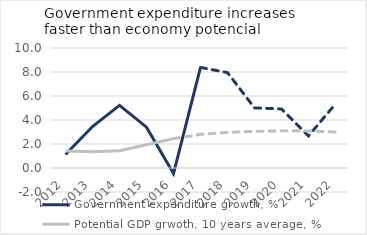
| Category | Government expenditure growth, % | Potential GDP grwoth, 10 years average, % |
|---|---|---|
| 2012 | 1.127 | 1.41 |
| 2013 | 3.456 | 1.359 |
| 2014 | 5.221 | 1.439 |
| 2015 | 3.403 | 1.938 |
| 2016 | -0.463 | 2.446 |
| 2017 | 8.379 | 2.802 |
| 2018 | 7.948 | 2.966 |
| 2019 | 5.01 | 3.055 |
| 2020 | 4.919 | 3.1 |
| 2021 | 2.675 | 3.091 |
| 2022 | 5.342 | 3 |